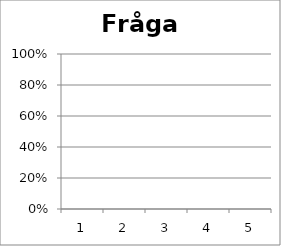
| Category | Fråga 7 |
|---|---|
| 0 | 0 |
| 1 | 0 |
| 2 | 0 |
| 3 | 0 |
| 4 | 0 |